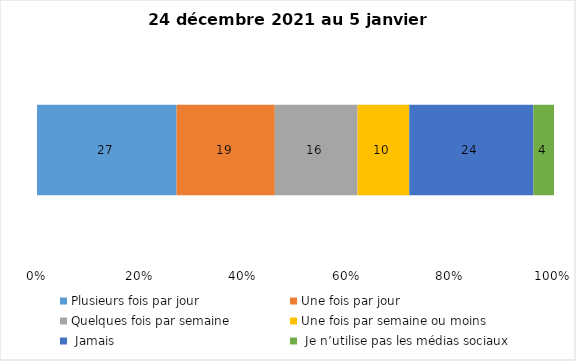
| Category | Plusieurs fois par jour | Une fois par jour | Quelques fois par semaine   | Une fois par semaine ou moins   |  Jamais   |  Je n’utilise pas les médias sociaux |
|---|---|---|---|---|---|---|
| 0 | 27 | 19 | 16 | 10 | 24 | 4 |